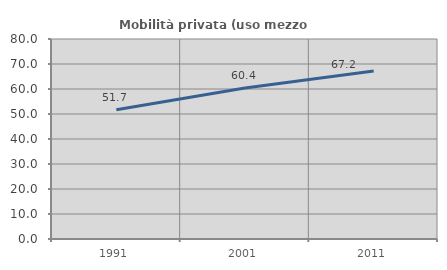
| Category | Mobilità privata (uso mezzo privato) |
|---|---|
| 1991.0 | 51.67 |
| 2001.0 | 60.364 |
| 2011.0 | 67.182 |